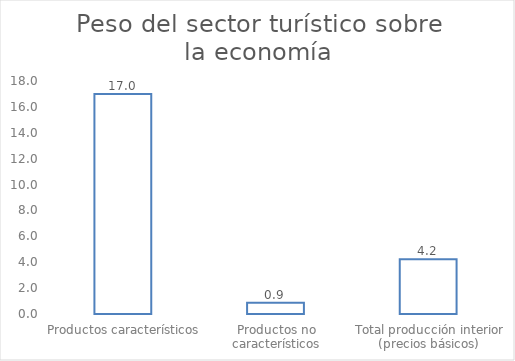
| Category | Series 0 |
|---|---|
| Productos característicos | 16.999 |
| Productos no característicos | 0.872 |
| Total producción interior (precios básicos) | 4.225 |